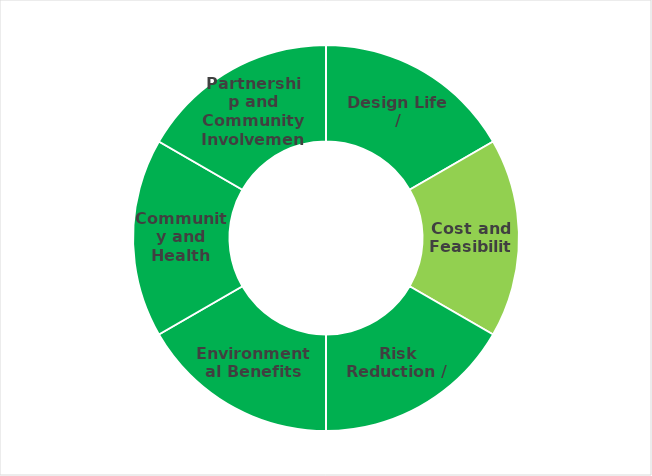
| Category | Ranking |
|---|---|
| Design Life / Adaptability | 1 |
| Cost and Feasibility | 1 |
| Risk Reduction / Effectiveness | 1 |
| Environmental Benefits | 1 |
| Community and Health Benefits | 1 |
| Partnership and Community Involvement | 1 |